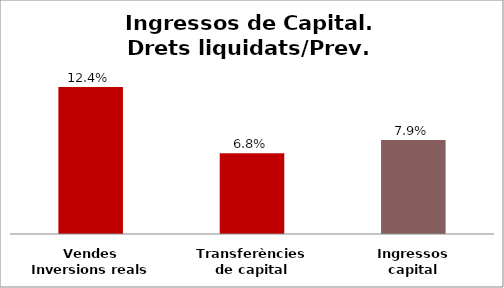
| Category | Series 0 |
|---|---|
| Vendes Inversions reals | 0.124 |
| Transferències de capital | 0.068 |
| Ingressos capital | 0.079 |